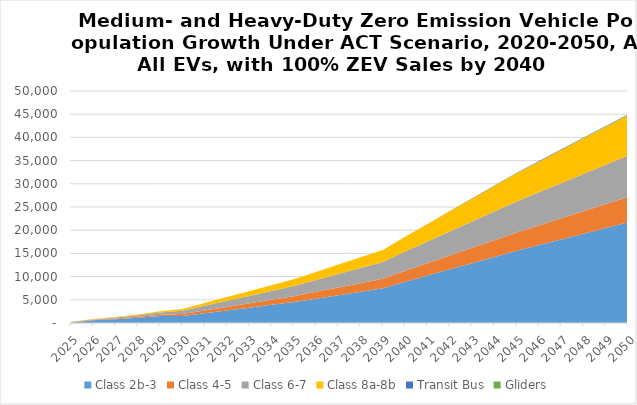
| Category | Class 2b-3 | Class 4-5 | Class 6-7 | Class 8a-8b | Transit Bus | Gliders |
|---|---|---|---|---|---|---|
| 2025.0 | 133.498 | 38.379 | 55.94 | 34.23 | 0 | 0 |
| 2026.0 | 566.538 | 82.036 | 123.577 | 73.025 | 0 | 0 |
| 2027.0 | 824.767 | 134.216 | 208.779 | 118.944 | 0 | 0 |
| 2028.0 | 1133.164 | 204.366 | 328.023 | 176.295 | 0 | 0 |
| 2029.0 | 1500.49 | 296.406 | 490.549 | 248.272 | 0 | 0 |
| 2030.0 | 1493.01 | 420.344 | 716.801 | 398.699 | 0 | 0 |
| 2031.0 | 2096.909 | 589.956 | 1014.541 | 605.497 | 0 | 0 |
| 2032.0 | 2700.807 | 759.568 | 1312.282 | 812.294 | 0 | 0 |
| 2033.0 | 3304.706 | 929.18 | 1610.022 | 1019.092 | 0 | 0 |
| 2034.0 | 3908.604 | 1098.792 | 1907.762 | 1225.889 | 0 | 0 |
| 2035.0 | 4512.503 | 1268.404 | 2205.503 | 1432.687 | 0 | 0 |
| 2036.0 | 5253.095 | 1464.05 | 2559.363 | 1724.602 | 0 | 0 |
| 2037.0 | 5993.687 | 1659.696 | 2913.223 | 2016.517 | 0 | 0 |
| 2038.0 | 6734.279 | 1855.342 | 3267.083 | 2308.432 | 0 | 0 |
| 2039.0 | 7474.871 | 2050.988 | 3620.942 | 2600.347 | 0 | 0 |
| 2040.0 | 8911.761 | 2338.074 | 4137.148 | 3198.16 | 9.904 | 7.713 |
| 2041.0 | 10241.583 | 2658.308 | 4644.439 | 3777.815 | 20.226 | 15.261 |
| 2042.0 | 11571.405 | 2978.542 | 5151.73 | 4357.471 | 30.547 | 22.809 |
| 2043.0 | 12901.227 | 3298.776 | 5659.022 | 4937.126 | 40.869 | 30.357 |
| 2044.0 | 14231.049 | 3619.01 | 6166.313 | 5516.782 | 51.191 | 37.904 |
| 2045.0 | 15560.871 | 3939.244 | 6673.604 | 6096.437 | 61.512 | 45.452 |
| 2046.0 | 16789.533 | 4241.305 | 7123.304 | 6623.931 | 72.513 | 52.688 |
| 2047.0 | 18018.196 | 4543.367 | 7573.005 | 7151.425 | 83.513 | 59.924 |
| 2048.0 | 19246.859 | 4845.428 | 8022.705 | 7678.919 | 94.513 | 67.16 |
| 2049.0 | 20475.521 | 5147.49 | 8472.405 | 8206.413 | 105.513 | 74.396 |
| 2050.0 | 21704.184 | 5449.552 | 8922.106 | 8733.907 | 116.513 | 81.632 |